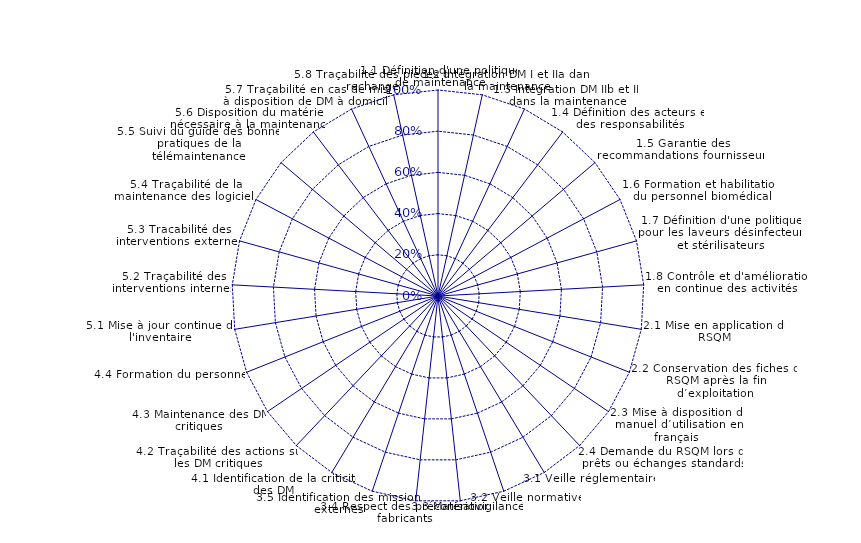
| Category | Moy+ET | Moyenne | Moy-ET |
|---|---|---|---|
| 1.1 Définition d'une politique de maintenance | 0 | 0 | 0 |
| 1.2 Intégration DM I et IIa dans la maintenance | 0 | 0 | 0 |
| 1.3 Intégration DM IIb et III dans la maintenance | 0 | 0 | 0 |
| 1.4 Définition des acteurs et des responsabilités | 0 | 0 | 0 |
| 1.5 Garantie des recommandations fournisseurs | 0 | 0 | 0 |
| 1.6 Formation et habilitation du personnel biomédical | 0 | 0 | 0 |
| 1.7 Définition d'une politique pour les laveurs désinfecteurs et stérilisateurs | 0 | 0 | 0 |
| 1.8 Contrôle et d'amélioration en continue des activités  | 0 | 0 | 0 |
| 2.1 Mise en application du RSQM | 0 | 0 | 0 |
| 2.2 Conservation des fiches du RSQM après la fin d’exploitation | 0 | 0 | 0 |
| 2.3 Mise à disposition du manuel d’utilisation en français  | 0 | 0 | 0 |
| 2.4 Demande du RSQM lors de prêts ou échanges standards | 0 | 0 | 0 |
| 3.1 Veille réglementaire | 0 | 0 | 0 |
| 3.2 Veille normative | 0 | 0 | 0 |
| 3.3 Matériovigilance | 0 | 0 | 0 |
| 3.4 Respect des préconisations fabricants | 0 | 0 | 0 |
| 3.5 Identification des missions externes | 0 | 0 | 0 |
| 4.1 Identification de la criticité des DM | 0 | 0 | 0 |
| 4.2 Traçabilité des actions sur les DM critiques | 0 | 0 | 0 |
| 4.3 Maintenance des DM critiques | 0 | 0 | 0 |
| 4.4 Formation du personnel | 0 | 0 | 0 |
| 5.1 Mise à jour continue de l'inventaire | 0 | 0 | 0 |
| 5.2 Traçabilité des interventions internes | 0 | 0 | 0 |
| 5.3 Tracabilité des interventions externes | 0 | 0 | 0 |
| 5.4 Traçabilité de la maintenance des logiciels | 0 | 0 | 0 |
| 5.5 Suivi du guide des bonnes pratiques de la télémaintenance | 0 | 0 | 0 |
| 5.6 Disposition du matériel nécessaire à la maintenance | 0 | 0 | 0 |
| 5.7 Traçabilité en cas de mise à disposition de DM à domicile | 0 | 0 | 0 |
| 5.8 Traçabilité des pièces de rechange | 0 | 0 | 0 |